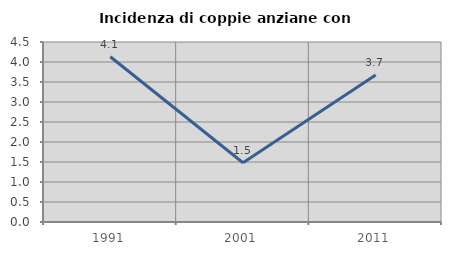
| Category | Incidenza di coppie anziane con figli |
|---|---|
| 1991.0 | 4.132 |
| 2001.0 | 1.481 |
| 2011.0 | 3.676 |